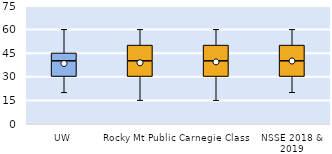
| Category | 25th | 50th | 75th |
|---|---|---|---|
| UW | 30 | 10 | 5 |
| Rocky Mt Public | 30 | 10 | 10 |
| Carnegie Class | 30 | 10 | 10 |
| NSSE 2018 & 2019 | 30 | 10 | 10 |